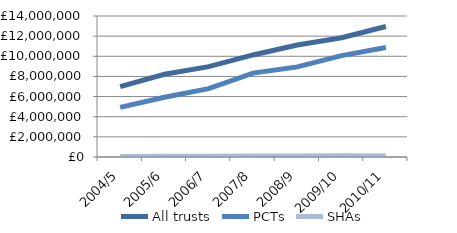
| Category | All trusts | PCTs | SHAs |
|---|---|---|---|
| 2004/5 | 6991023 | 4932251 | 58721 |
| 2005/6 | 8214109 | 5933214 | 67368 |
| 2006/7 | 8969197 | 6792028 | 72493 |
| 2007/8 | 10132245 | 8327705 | 94749 |
| 2008/9 | 11126240 | 8949262 | 109351 |
| 2009/10 | 11841634 | 10063998 | 111812 |
| 2010/11 | 12961219 | 10873841 | 96254 |